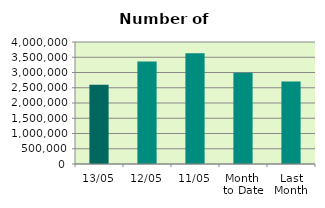
| Category | Series 0 |
|---|---|
| 13/05 | 2597858 |
| 12/05 | 3362004 |
| 11/05 | 3631176 |
| Month 
to Date | 2991790.222 |
| Last
Month | 2707305.9 |